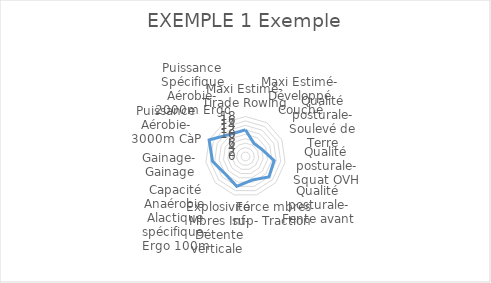
| Category | EXEMPLE 1 Exemple |
|---|---|
| Maxi Estimé- Tirade Rowing | 12 |
| Maxi Estimé- Développé Couché | 7 |
| Qualité posturale- Soulevé de Terre | 8 |
| Qualité posturale- Squat OVH | 13 |
| Qualité posturale- Fente avant | 14 |
| Force mbres sup- Traction  | 11 |
| Explosivité Mbres Inf- Détente verticale  | 14 |
| Capacité Anaérobie Alactique spécifique- Ergo 100m | 12 |
| Gainage- Gainage | 15 |
| Puissance Aérobie- 3000m CàP | 18 |
| Puissance Spécifique Aérobie- 2000m Ergo | 12 |